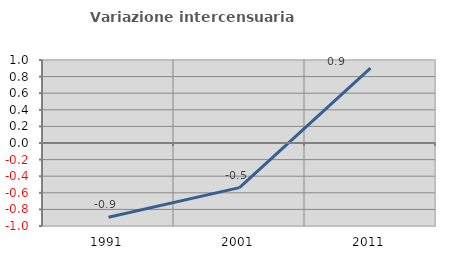
| Category | Variazione intercensuaria annua |
|---|---|
| 1991.0 | -0.894 |
| 2001.0 | -0.537 |
| 2011.0 | 0.901 |